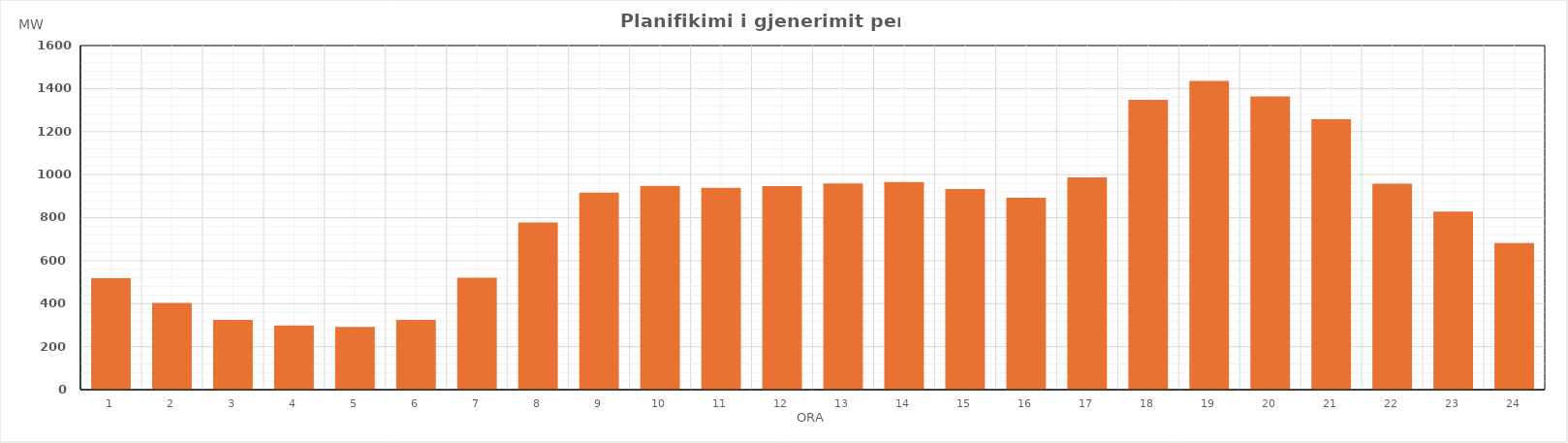
| Category | Max (MW) |
|---|---|
| 0 | 518.62 |
| 1 | 403.86 |
| 2 | 324.2 |
| 3 | 299.1 |
| 4 | 291.29 |
| 5 | 324.88 |
| 6 | 520.22 |
| 7 | 777.76 |
| 8 | 915.7 |
| 9 | 947.13 |
| 10 | 939.02 |
| 11 | 946.37 |
| 12 | 959.4 |
| 13 | 966.16 |
| 14 | 932.63 |
| 15 | 892.72 |
| 16 | 987.2 |
| 17 | 1347.25 |
| 18 | 1435.78 |
| 19 | 1363.54 |
| 20 | 1257.87 |
| 21 | 957.67 |
| 22 | 828.72 |
| 23 | 681.34 |